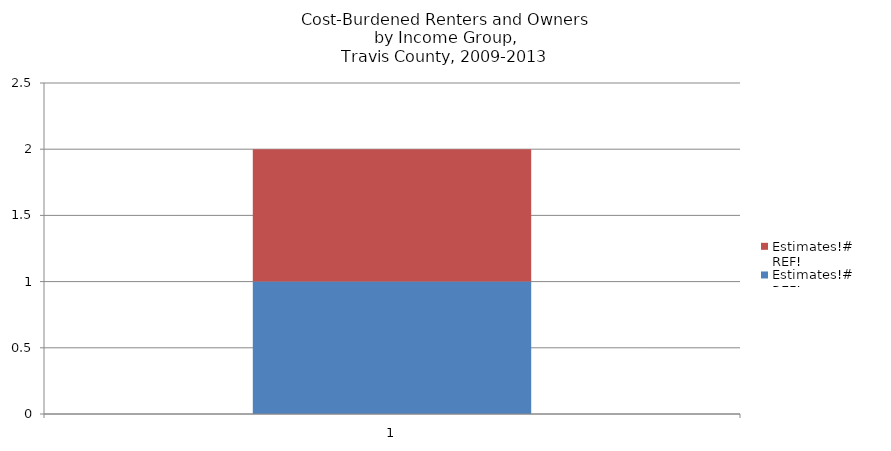
| Category | Estimates!#REF! |
|---|---|
| 0 | 1 |